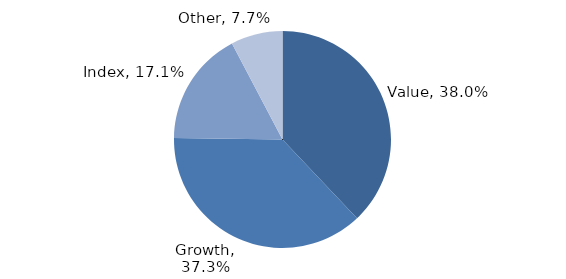
| Category | Investment Style |
|---|---|
| Value | 0.38 |
| Growth | 0.373 |
| Index | 0.171 |
| Other | 0.077 |